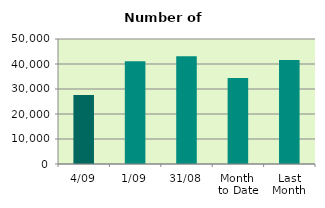
| Category | Series 0 |
|---|---|
| 4/09 | 27590 |
| 1/09 | 41122 |
| 31/08 | 43092 |
| Month 
to Date | 34356 |
| Last
Month | 41597.13 |